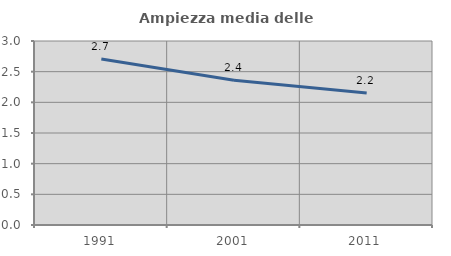
| Category | Ampiezza media delle famiglie |
|---|---|
| 1991.0 | 2.708 |
| 2001.0 | 2.36 |
| 2011.0 | 2.152 |